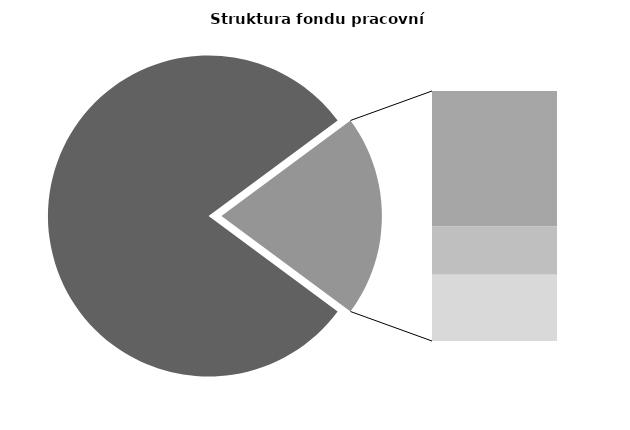
| Category | Series 0 |
|---|---|
| Průměrná měsíční odpracovaná doba bez přesčasu | 136.885 |
| Dovolená | 18.878 |
| Nemoc | 6.704 |
| Jiné | 9.244 |